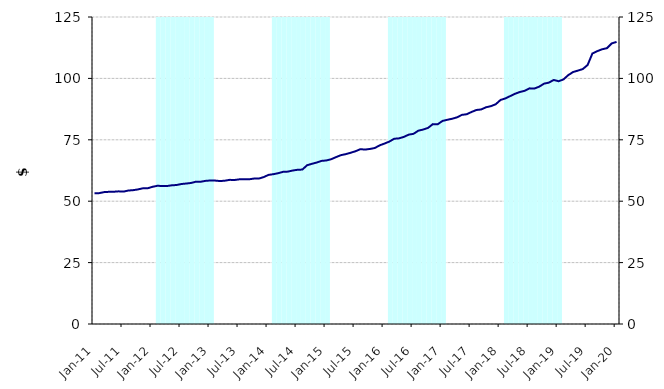
| Category | Series 1 |
|---|---|
| 0 | 0 |
| 1900-01-01 | 0 |
| 1900-01-02 | 0 |
| 1900-01-03 | 0 |
| 1900-01-04 | 0 |
| 1900-01-05 | 0 |
| 1900-01-06 | 0 |
| 1900-01-07 | 0 |
| 1900-01-08 | 0 |
| 1900-01-09 | 0 |
| 1900-01-10 | 0 |
| 1900-01-11 | 0 |
| 1900-01-12 | 0 |
| 1900-01-13 | 125000000 |
| 1900-01-14 | 125000000 |
| 1900-01-15 | 125000000 |
| 1900-01-16 | 125000000 |
| 1900-01-17 | 125000000 |
| 1900-01-18 | 125000000 |
| 1900-01-19 | 125000000 |
| 1900-01-20 | 125000000 |
| 1900-01-21 | 125000000 |
| 1900-01-22 | 125000000 |
| 1900-01-23 | 125000000 |
| 1900-01-24 | 125000000 |
| 1900-01-25 | 0 |
| 1900-01-26 | 0 |
| 1900-01-27 | 0 |
| 1900-01-28 | 0 |
| 1900-01-29 | 0 |
| 1900-01-30 | 0 |
| 1900-01-31 | 0 |
| 1900-02-01 | 0 |
| 1900-02-02 | 0 |
| 1900-02-03 | 0 |
| 1900-02-04 | 0 |
| 1900-02-05 | 0 |
| 1900-02-06 | 125000000 |
| 1900-02-07 | 125000000 |
| 1900-02-08 | 125000000 |
| 1900-02-09 | 125000000 |
| 1900-02-10 | 125000000 |
| 1900-02-11 | 125000000 |
| 1900-02-12 | 125000000 |
| 1900-02-13 | 125000000 |
| 1900-02-14 | 125000000 |
| 1900-02-15 | 125000000 |
| 1900-02-16 | 125000000 |
| 1900-02-17 | 125000000 |
| 1900-02-18 | 0 |
| 1900-02-19 | 0 |
| 1900-02-20 | 0 |
| 1900-02-21 | 0 |
| 1900-02-22 | 0 |
| 1900-02-23 | 0 |
| 1900-02-24 | 0 |
| 1900-02-25 | 0 |
| 1900-02-26 | 0 |
| 1900-02-27 | 0 |
| 1900-02-28 | 0 |
| 1900-02-28 | 0 |
| 1900-03-01 | 125000000 |
| 1900-03-02 | 125000000 |
| 1900-03-03 | 125000000 |
| 1900-03-04 | 125000000 |
| 1900-03-05 | 125000000 |
| 1900-03-06 | 125000000 |
| 1900-03-07 | 125000000 |
| 1900-03-08 | 125000000 |
| 1900-03-09 | 125000000 |
| 1900-03-10 | 125000000 |
| 1900-03-11 | 125000000 |
| 1900-03-12 | 125000000 |
| 1900-03-13 | 0 |
| 1900-03-14 | 0 |
| 1900-03-15 | 0 |
| 1900-03-16 | 0 |
| 1900-03-17 | 0 |
| 1900-03-18 | 0 |
| 1900-03-19 | 0 |
| 1900-03-20 | 0 |
| 1900-03-21 | 0 |
| 1900-03-22 | 0 |
| 1900-03-23 | 0 |
| 1900-03-24 | 0 |
| 1900-03-25 | 125000000 |
| 1900-03-26 | 125000000 |
| 1900-03-27 | 125000000 |
| 1900-03-28 | 125000000 |
| 1900-03-29 | 125000000 |
| 1900-03-30 | 125000000 |
| 1900-03-31 | 125000000 |
| 1900-04-01 | 125000000 |
| 1900-04-02 | 125000000 |
| 1900-04-03 | 125000000 |
| 1900-04-04 | 125000000 |
| 1900-04-05 | 125000000 |
| 1900-04-06 | 0 |
| 1900-04-07 | 0 |
| 1900-04-08 | 0 |
| 1900-04-09 | 0 |
| 1900-04-10 | 0 |
| 1900-04-11 | 0 |
| 1900-04-12 | 0 |
| 1900-04-13 | 0 |
| 1900-04-14 | 0 |
| 1900-04-15 | 0 |
| 1900-04-16 | 0 |
| 1900-04-17 | 0 |